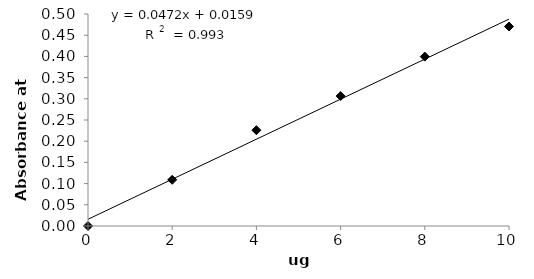
| Category | Series 0 |
|---|---|
| 0.0 | 0 |
| 2.0 | 0.109 |
| 4.0 | 0.226 |
| 6.0 | 0.306 |
| 8.0 | 0.4 |
| 10.0 | 0.471 |